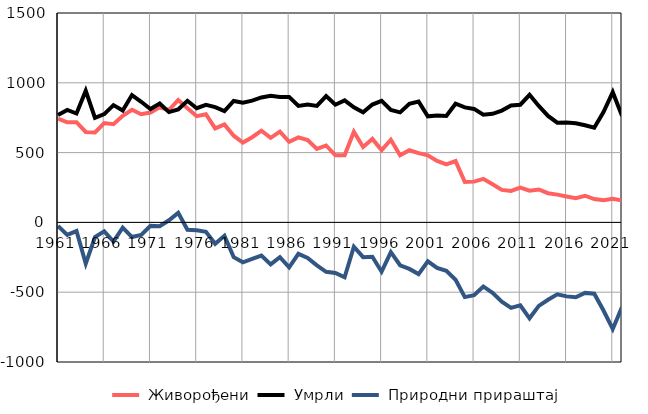
| Category |  Живорођени |  Умрли |  Природни прираштај |
|---|---|---|---|
| 1961.0 | 744 | 770 | -26 |
| 1962.0 | 717 | 806 | -89 |
| 1963.0 | 718 | 780 | -62 |
| 1964.0 | 648 | 943 | -295 |
| 1965.0 | 644 | 749 | -105 |
| 1966.0 | 712 | 776 | -64 |
| 1967.0 | 703 | 840 | -137 |
| 1968.0 | 764 | 801 | -37 |
| 1969.0 | 807 | 912 | -105 |
| 1970.0 | 775 | 864 | -89 |
| 1971.0 | 787 | 812 | -25 |
| 1972.0 | 824 | 851 | -27 |
| 1973.0 | 805 | 790 | 15 |
| 1974.0 | 877 | 809 | 68 |
| 1975.0 | 818 | 871 | -53 |
| 1976.0 | 761 | 818 | -57 |
| 1977.0 | 775 | 842 | -67 |
| 1978.0 | 673 | 826 | -153 |
| 1979.0 | 702 | 798 | -96 |
| 1980.0 | 621 | 870 | -249 |
| 1981.0 | 572 | 858 | -286 |
| 1982.0 | 610 | 872 | -262 |
| 1983.0 | 657 | 895 | -238 |
| 1984.0 | 606 | 907 | -301 |
| 1985.0 | 650 | 899 | -249 |
| 1986.0 | 577 | 899 | -322 |
| 1987.0 | 609 | 834 | -225 |
| 1988.0 | 590 | 845 | -255 |
| 1989.0 | 526 | 834 | -308 |
| 1990.0 | 551 | 905 | -354 |
| 1991.0 | 481 | 843 | -362 |
| 1992.0 | 481 | 874 | -393 |
| 1993.0 | 650 | 824 | -174 |
| 1994.0 | 540 | 789 | -249 |
| 1995.0 | 598 | 844 | -246 |
| 1996.0 | 518 | 871 | -353 |
| 1997.0 | 592 | 805 | -213 |
| 1998.0 | 481 | 788 | -307 |
| 1999.0 | 517 | 850 | -333 |
| 2000.0 | 496 | 866 | -370 |
| 2001.0 | 481 | 760 | -279 |
| 2002.0 | 440 | 766 | -326 |
| 2003.0 | 415 | 762 | -347 |
| 2004.0 | 439 | 850 | -411 |
| 2005.0 | 289 | 824 | -535 |
| 2006.0 | 292 | 813 | -521 |
| 2007.0 | 312 | 771 | -459 |
| 2008.0 | 273 | 778 | -505 |
| 2009.0 | 233 | 801 | -568 |
| 2010.0 | 225 | 837 | -612 |
| 2011.0 | 249 | 843 | -594 |
| 2012.0 | 227 | 914 | -687 |
| 2013.0 | 236 | 834 | -598 |
| 2014.0 | 209 | 763 | -554 |
| 2015.0 | 199 | 714 | -515 |
| 2016.0 | 186 | 716 | -530 |
| 2017.0 | 174 | 710 | -536 |
| 2018.0 | 191 | 696 | -505 |
| 2019.0 | 167 | 678 | -511 |
| 2020.0 | 159 | 790 | -631 |
| 2021.0 | 170 | 933 | -763 |
| 2022.0 | 157 | 763 | -606 |